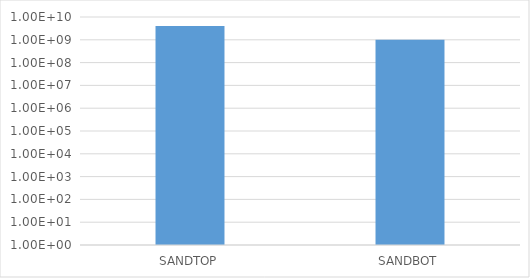
| Category | Series 0 |
|---|---|
| SANDTOP | 4000785008.071 |
| SANDBOT | 994709459.229 |